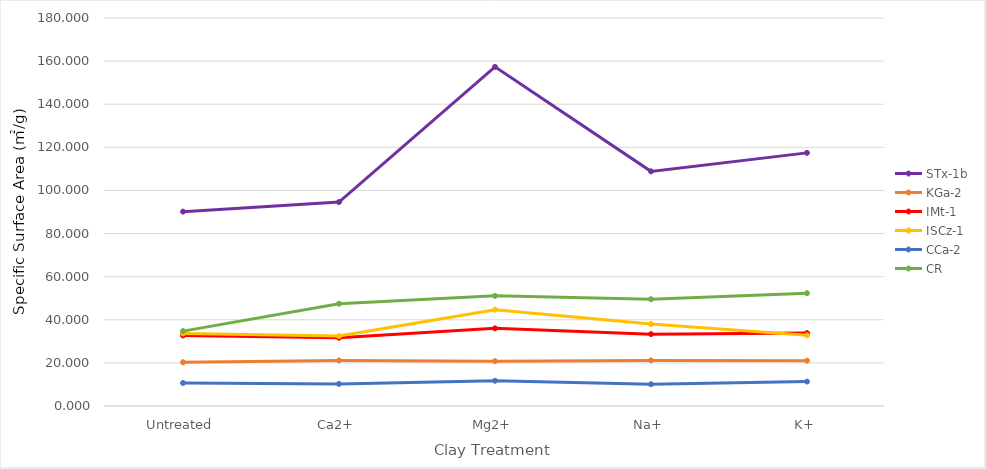
| Category | STx-1b | KGa-2 | IMt-1 | ISCz-1 | CCa-2 | CR |
|---|---|---|---|---|---|---|
| 0 | 90.163 | 20.302 | 32.707 | 33.649 | 10.677 | 34.743 |
| 1 | 94.62 | 21.131 | 31.634 | 32.474 | 10.251 | 47.445 |
| 2 | 157.34 | 20.818 | 36.019 | 44.696 | 11.727 | 51.089 |
| 3 | 108.85 | 21.148 | 33.34 | 38.005 | 10.103 | 49.532 |
| 4 | 117.43 | 21.032 | 33.827 | 32.789 | 11.323 | 52.343 |